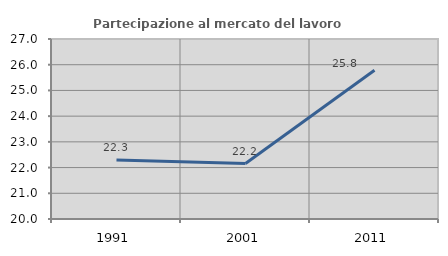
| Category | Partecipazione al mercato del lavoro  femminile |
|---|---|
| 1991.0 | 22.29 |
| 2001.0 | 22.157 |
| 2011.0 | 25.784 |